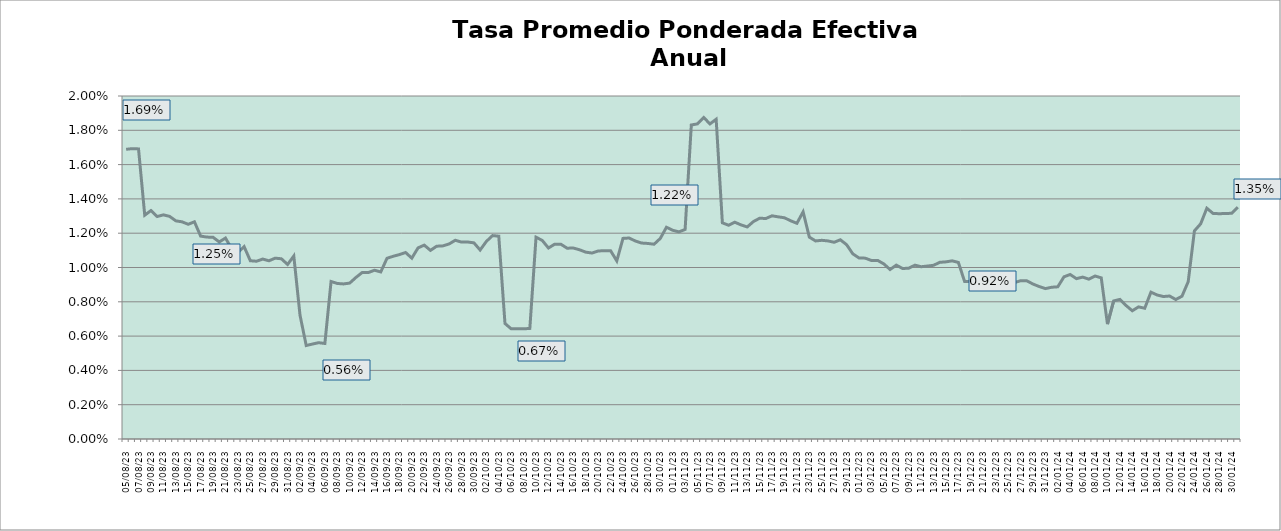
| Category | TEA |
|---|---|
| 2023-08-05 | 0.017 |
| 2023-08-06 | 0.017 |
| 2023-08-07 | 0.017 |
| 2023-08-08 | 0.013 |
| 2023-08-09 | 0.013 |
| 2023-08-10 | 0.013 |
| 2023-08-11 | 0.013 |
| 2023-08-12 | 0.013 |
| 2023-08-13 | 0.013 |
| 2023-08-14 | 0.013 |
| 2023-08-15 | 0.013 |
| 2023-08-16 | 0.013 |
| 2023-08-17 | 0.012 |
| 2023-08-18 | 0.012 |
| 2023-08-19 | 0.012 |
| 2023-08-20 | 0.011 |
| 2023-08-21 | 0.012 |
| 2023-08-22 | 0.011 |
| 2023-08-23 | 0.011 |
| 2023-08-24 | 0.011 |
| 2023-08-25 | 0.01 |
| 2023-08-26 | 0.01 |
| 2023-08-27 | 0.01 |
| 2023-08-28 | 0.01 |
| 2023-08-29 | 0.011 |
| 2023-08-30 | 0.011 |
| 2023-08-31 | 0.01 |
| 2023-09-01 | 0.011 |
| 2023-09-02 | 0.007 |
| 2023-09-03 | 0.005 |
| 2023-09-04 | 0.006 |
| 2023-09-05 | 0.006 |
| 2023-09-06 | 0.006 |
| 2023-09-07 | 0.009 |
| 2023-09-08 | 0.009 |
| 2023-09-09 | 0.009 |
| 2023-09-10 | 0.009 |
| 2023-09-11 | 0.009 |
| 2023-09-12 | 0.01 |
| 2023-09-13 | 0.01 |
| 2023-09-14 | 0.01 |
| 2023-09-15 | 0.01 |
| 2023-09-16 | 0.011 |
| 2023-09-17 | 0.011 |
| 2023-09-18 | 0.011 |
| 2023-09-19 | 0.011 |
| 2023-09-20 | 0.011 |
| 2023-09-21 | 0.011 |
| 2023-09-22 | 0.011 |
| 2023-09-23 | 0.011 |
| 2023-09-24 | 0.011 |
| 2023-09-25 | 0.011 |
| 2023-09-26 | 0.011 |
| 2023-09-27 | 0.012 |
| 2023-09-28 | 0.011 |
| 2023-09-29 | 0.011 |
| 2023-09-30 | 0.011 |
| 2023-10-01 | 0.011 |
| 2023-10-02 | 0.012 |
| 2023-10-03 | 0.012 |
| 2023-10-04 | 0.012 |
| 2023-10-05 | 0.007 |
| 2023-10-06 | 0.006 |
| 2023-10-07 | 0.006 |
| 2023-10-08 | 0.006 |
| 2023-10-09 | 0.006 |
| 2023-10-10 | 0.012 |
| 2023-10-11 | 0.012 |
| 2023-10-12 | 0.011 |
| 2023-10-13 | 0.011 |
| 2023-10-14 | 0.011 |
| 2023-10-15 | 0.011 |
| 2023-10-16 | 0.011 |
| 2023-10-17 | 0.011 |
| 2023-10-18 | 0.011 |
| 2023-10-19 | 0.011 |
| 2023-10-20 | 0.011 |
| 2023-10-21 | 0.011 |
| 2023-10-22 | 0.011 |
| 2023-10-23 | 0.01 |
| 2023-10-24 | 0.012 |
| 2023-10-25 | 0.012 |
| 2023-10-26 | 0.012 |
| 2023-10-27 | 0.011 |
| 2023-10-28 | 0.011 |
| 2023-10-29 | 0.011 |
| 2023-10-30 | 0.012 |
| 2023-10-31 | 0.012 |
| 2023-11-01 | 0.012 |
| 2023-11-02 | 0.012 |
| 2023-11-03 | 0.012 |
| 2023-11-04 | 0.018 |
| 2023-11-05 | 0.018 |
| 2023-11-06 | 0.019 |
| 2023-11-07 | 0.018 |
| 2023-11-08 | 0.019 |
| 2023-11-09 | 0.013 |
| 2023-11-10 | 0.012 |
| 2023-11-11 | 0.013 |
| 2023-11-12 | 0.012 |
| 2023-11-13 | 0.012 |
| 2023-11-14 | 0.013 |
| 2023-11-15 | 0.013 |
| 2023-11-16 | 0.013 |
| 2023-11-17 | 0.013 |
| 2023-11-18 | 0.013 |
| 2023-11-19 | 0.013 |
| 2023-11-20 | 0.013 |
| 2023-11-21 | 0.013 |
| 2023-11-22 | 0.013 |
| 2023-11-23 | 0.012 |
| 2023-11-24 | 0.012 |
| 2023-11-25 | 0.012 |
| 2023-11-26 | 0.012 |
| 2023-11-27 | 0.011 |
| 2023-11-28 | 0.012 |
| 2023-11-29 | 0.011 |
| 2023-11-30 | 0.011 |
| 2023-12-01 | 0.011 |
| 2023-12-02 | 0.011 |
| 2023-12-03 | 0.01 |
| 2023-12-04 | 0.01 |
| 2023-12-05 | 0.01 |
| 2023-12-06 | 0.01 |
| 2023-12-07 | 0.01 |
| 2023-12-08 | 0.01 |
| 2023-12-09 | 0.01 |
| 2023-12-10 | 0.01 |
| 2023-12-11 | 0.01 |
| 2023-12-12 | 0.01 |
| 2023-12-13 | 0.01 |
| 2023-12-14 | 0.01 |
| 2023-12-15 | 0.01 |
| 2023-12-16 | 0.01 |
| 2023-12-17 | 0.01 |
| 2023-12-18 | 0.009 |
| 2023-12-19 | 0.009 |
| 2023-12-20 | 0.009 |
| 2023-12-21 | 0.009 |
| 2023-12-22 | 0.009 |
| 2023-12-23 | 0.009 |
| 2023-12-24 | 0.009 |
| 2023-12-25 | 0.009 |
| 2023-12-26 | 0.009 |
| 2023-12-27 | 0.009 |
| 2023-12-28 | 0.009 |
| 2023-12-29 | 0.009 |
| 2023-12-30 | 0.009 |
| 2023-12-31 | 0.009 |
| 2024-01-01 | 0.009 |
| 2024-01-02 | 0.009 |
| 2024-01-03 | 0.009 |
| 2024-01-04 | 0.01 |
| 2024-01-05 | 0.009 |
| 2024-01-06 | 0.009 |
| 2024-01-07 | 0.009 |
| 2024-01-08 | 0.01 |
| 2024-01-09 | 0.009 |
| 2024-01-10 | 0.007 |
| 2024-01-11 | 0.008 |
| 2024-01-12 | 0.008 |
| 2024-01-13 | 0.008 |
| 2024-01-14 | 0.007 |
| 2024-01-15 | 0.008 |
| 2024-01-16 | 0.008 |
| 2024-01-17 | 0.009 |
| 2024-01-18 | 0.008 |
| 2024-01-19 | 0.008 |
| 2024-01-20 | 0.008 |
| 2024-01-21 | 0.008 |
| 2024-01-22 | 0.008 |
| 2024-01-23 | 0.009 |
| 2024-01-24 | 0.012 |
| 2024-01-25 | 0.013 |
| 2024-01-26 | 0.013 |
| 2024-01-27 | 0.013 |
| 2024-01-28 | 0.013 |
| 2024-01-29 | 0.013 |
| 2024-01-30 | 0.013 |
| 2024-01-31 | 0.014 |